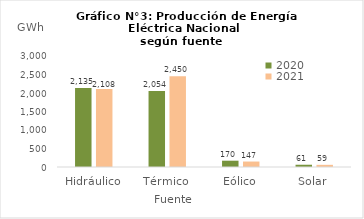
| Category | 2020 | 2021 |
|---|---|---|
| Hidráulico | 2134.872 | 2107.874 |
| Térmico | 2054.403 | 2449.549 |
| Eólico | 170.275 | 147.452 |
| Solar | 61.055 | 58.62 |